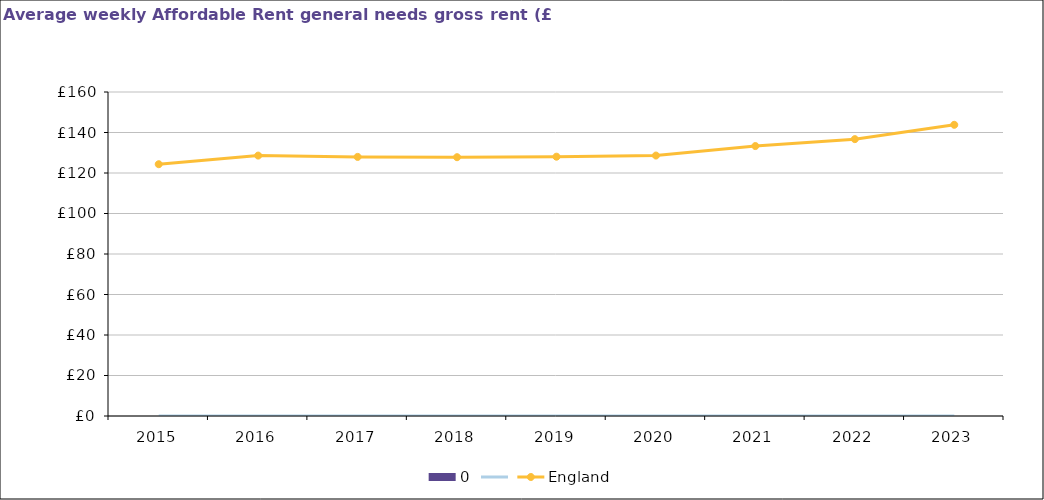
| Category | 0 |
|---|---|
| 2015.0 | 0 |
| 2016.0 | 0 |
| 2017.0 | 0 |
| 2018.0 | 0 |
| 2019.0 | 0 |
| 2020.0 | 0 |
| 2021.0 | 0 |
| 2022.0 | 0 |
| 2023.0 | 0 |